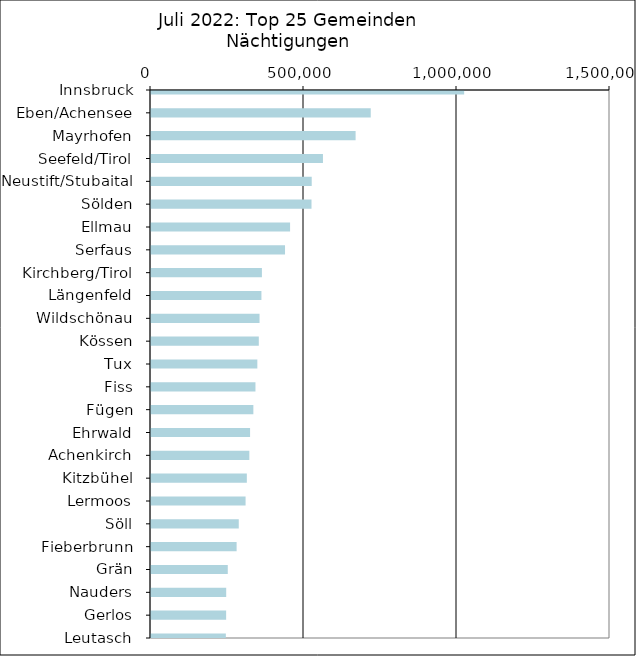
| Category | Series 0 |
|---|---|
| Innsbruck | 1023409 |
| Eben/Achensee | 718093 |
| Mayrhofen | 668638 |
| Seefeld/Tirol | 561928 |
| Neustift/Stubaital | 525219 |
| Sölden | 524496 |
| Ellmau | 454500 |
| Serfaus | 437974 |
| Kirchberg/Tirol | 362446 |
| Längenfeld | 360859 |
| Wildschönau | 354713 |
| Kössen | 352301 |
| Tux | 347492 |
| Fiss | 341354 |
| Fügen | 334493 |
| Ehrwald | 323780 |
| Achenkirch | 321387 |
| Kitzbühel | 313183 |
| Lermoos | 309066 |
| Söll | 286828 |
| Fieberbrunn | 279779 |
| Grän | 250909 |
| Nauders | 245735 |
| Gerlos | 245547 |
| Leutasch | 244600 |